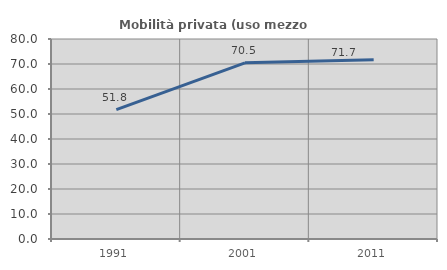
| Category | Mobilità privata (uso mezzo privato) |
|---|---|
| 1991.0 | 51.75 |
| 2001.0 | 70.475 |
| 2011.0 | 71.707 |